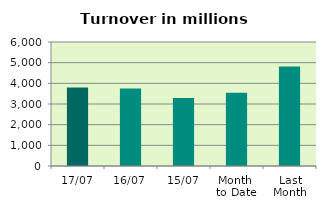
| Category | Series 0 |
|---|---|
| 17/07 | 3800.073 |
| 16/07 | 3745.562 |
| 15/07 | 3285.387 |
| Month 
to Date | 3541.877 |
| Last
Month | 4815.104 |